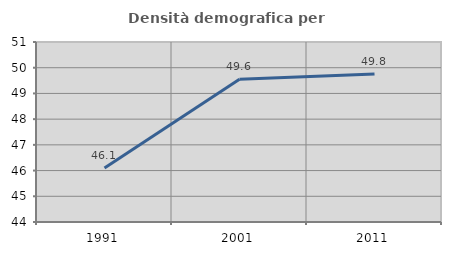
| Category | Densità demografica |
|---|---|
| 1991.0 | 46.101 |
| 2001.0 | 49.551 |
| 2011.0 | 49.754 |